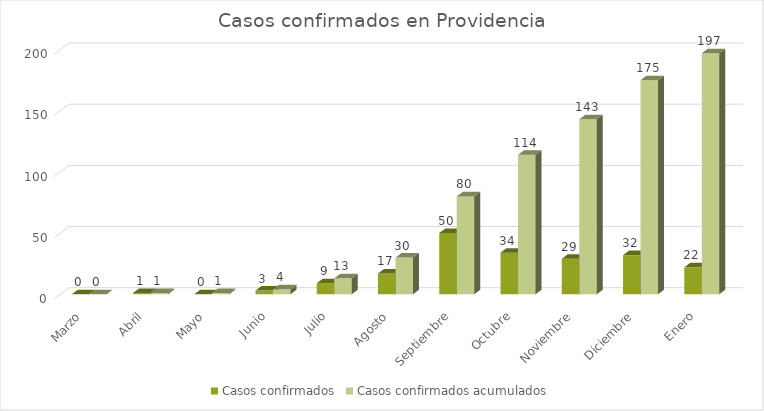
| Category | Casos confirmados | Casos confirmados acumulados |
|---|---|---|
| Marzo | 0 | 0 |
| Abril | 1 | 1 |
| Mayo | 0 | 1 |
| Junio | 3 | 4 |
| Julio | 9 | 13 |
| Agosto | 17 | 30 |
| Septiembre | 50 | 80 |
| Octubre | 34 | 114 |
| Noviembre | 29 | 143 |
| Diciembre | 32 | 175 |
| Enero | 22 | 197 |